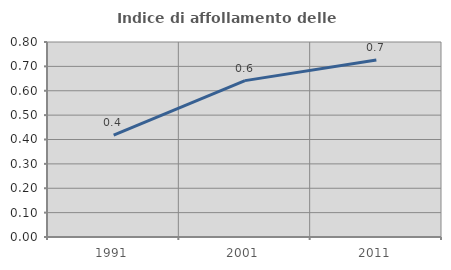
| Category | Indice di affollamento delle abitazioni  |
|---|---|
| 1991.0 | 0.418 |
| 2001.0 | 0.642 |
| 2011.0 | 0.726 |